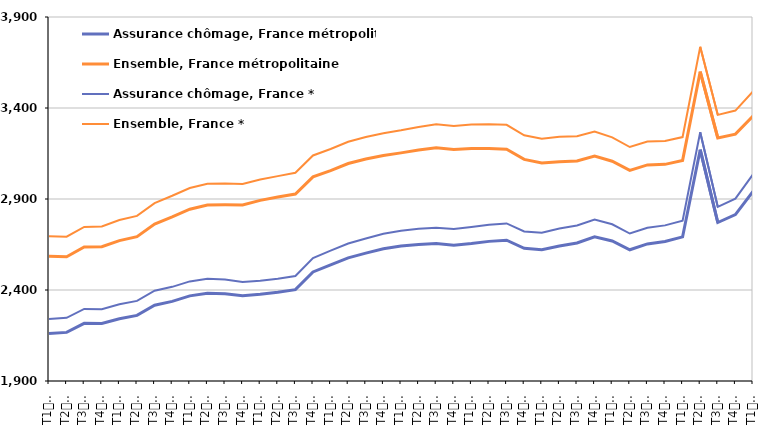
| Category | Assurance chômage, France métropolitaine | Ensemble, France métropolitaine | Assurance chômage, France * | Ensemble, France * |
|---|---|---|---|---|
| T1
2011 | 2160.9 | 2584.8 | 2240.8 | 2695.6 |
| T2
2011 | 2167.1 | 2582.2 | 2247.1 | 2693 |
| T3
2011 | 2216.8 | 2636.3 | 2296 | 2746.6 |
| T4
2011 | 2216 | 2637.9 | 2294.9 | 2749.3 |
| T1
2012 | 2242.1 | 2671.5 | 2321.3 | 2784.3 |
| T2
2012 | 2260.5 | 2693.2 | 2340.2 | 2807.2 |
| T3
2012 | 2316.1 | 2762.2 | 2396.2 | 2877.6 |
| T4
2012 | 2337.5 | 2801.5 | 2417.4 | 2917.7 |
| T1
2013 | 2367.8 | 2843.7 | 2447.3 | 2960.5 |
| T2
2013 | 2382.7 | 2867.2 | 2461.6 | 2984.3 |
| T3
2013 | 2379.9 | 2868.3 | 2457.9 | 2985 |
| T4
2013 | 2368 | 2867.5 | 2444 | 2982.8 |
| T1
2014 | 2376.6 | 2892.6 | 2451.1 | 3007.5 |
| T2
2014 | 2388.1 | 2911.3 | 2462 | 3025.7 |
| T3
2014 | 2401.9 | 2927.3 | 2477 | 3044.2 |
| T4
2014 | 2499 | 3021.9 | 2575.9 | 3139.2 |
| T1
2015 | 2537.9 | 3056.1 | 2616.1 | 3174.8 |
| T2
2015 | 2576.4 | 3094.9 | 2655.6 | 3214.4 |
| T3
2015 | 2602.7 | 3119.5 | 2683.2 | 3240.7 |
| T4
2015 | 2626.7 | 3139.4 | 2709 | 3261.5 |
| T1
2016 | 2641.9 | 3153.4 | 2726 | 3277.2 |
| T2
2016 | 2650.6 | 3169.4 | 2736.2 | 3295.6 |
| T3
2016 | 2655.1 | 3182.1 | 2741.6 | 3310.2 |
| T4
2016 | 2646.4 | 3172.1 | 2735.2 | 3301.1 |
| T1
2017 | 2655.2 | 3178 | 2746.3 | 3309.6 |
| T2
2017 | 2667.2 | 3177.8 | 2759.1 | 3310.7 |
| T3
2017 | 2673.4 | 3173.6 | 2765.9 | 3307.8 |
| T4
2017 | 2629.3 | 3117.5 | 2721.7 | 3249.7 |
| T1
2018 | 2620.8 | 3097.4 | 2714.4 | 3230.9 |
| T2
2018 | 2641.7 | 3105.1 | 2738.2 | 3241.4 |
| T3
2018 | 2658.1 | 3109 | 2754.8 | 3245.3 |
| T4
2018 | 2692.4 | 3136.4 | 2787.6 | 3270.8 |
| T1
2019 | 2669.1 | 3107.7 | 2761 | 3238.6 |
| T2
2019 | 2621 | 3056.9 | 2710.3 | 3185.7 |
| T3
2019 | 2653.3 | 3087.3 | 2742.2 | 3216.2 |
| T4
2019 | 2666.6 | 3090.4 | 2755.1 | 3218.6 |
| T1
2020 | 2692 | 3112.2 | 2780.4 | 3240.3 |
| T2
2020 | 3170.8 | 3600 | 3266.8 | 3736 |
| T3
2020 | 2770.9 | 3235.6 | 2856.4 | 3362 |
| T4
2020 | 2814.3 | 3256.4 | 2901.9 | 3385.8 |
| T1
2021 | 2941.2 | 3355.9 | 3035.6 | 3491.1 |